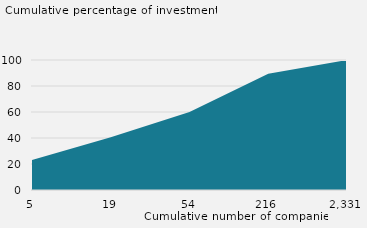
| Category | Cumulative percentage of investments |
|---|---|
| 5.0 | 22.997 |
| 19.0 | 40.606 |
| 54.0 | 60.024 |
| 216.0 | 89.41 |
| 2331.0 | 100 |